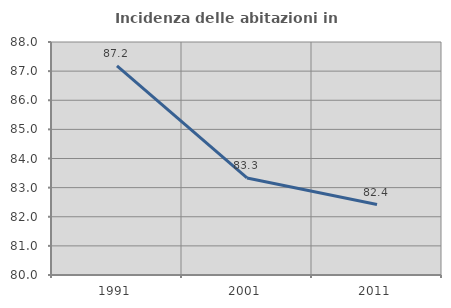
| Category | Incidenza delle abitazioni in proprietà  |
|---|---|
| 1991.0 | 87.179 |
| 2001.0 | 83.333 |
| 2011.0 | 82.418 |